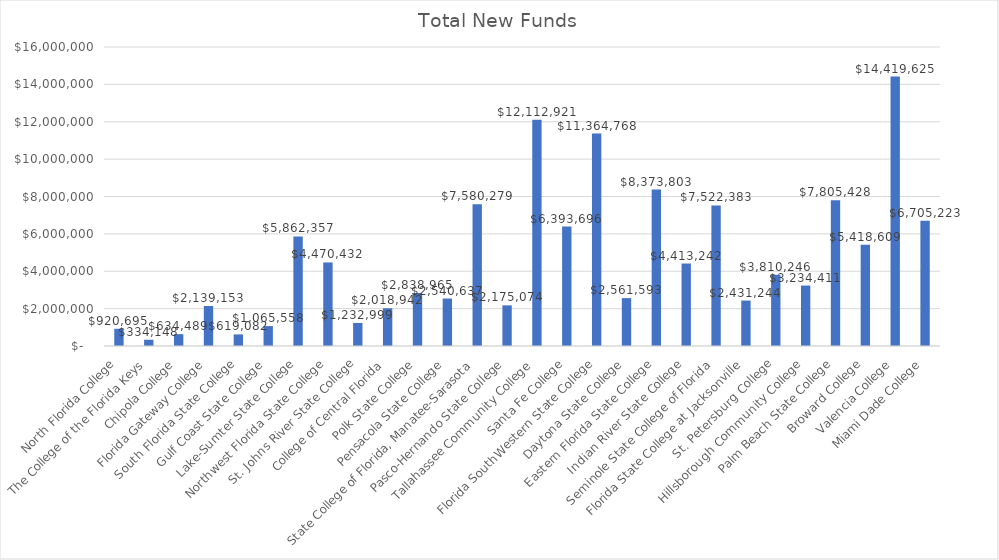
| Category | Total New Funds |
|---|---|
| North Florida College | 920694.916 |
| The College of the Florida Keys | 334148.096 |
| Chipola College | 634488.802 |
| Florida Gateway College | 2139152.574 |
| South Florida State College | 619082.291 |
| Gulf Coast State College | 1065557.607 |
| Lake-Sumter State College | 5862356.504 |
| Northwest Florida State College | 4470431.708 |
| St. Johns River State College | 1232998.567 |
| College of Central Florida | 2018941.795 |
| Polk State College | 2838965.078 |
| Pensacola State College | 2540637.038 |
| State College of Florida, Manatee-Sarasota | 7580279.448 |
| Pasco-Hernando State College | 2175074.034 |
| Tallahassee Community College | 12112921.476 |
| Santa Fe College | 6393695.992 |
| Florida SouthWestern State College | 11364767.989 |
| Daytona State College | 2561592.547 |
| Eastern Florida State College | 8373802.745 |
| Indian River State College | 4413241.588 |
| Seminole State College of Florida | 7522382.849 |
| Florida State College at Jacksonville | 2431244.365 |
| St. Petersburg College | 3810245.658 |
| Hillsborough Community College | 3234411.015 |
| Palm Beach State College | 7805427.671 |
| Broward College | 5418609.189 |
| Valencia College | 14419625.158 |
| Miami Dade College | 6705223.299 |